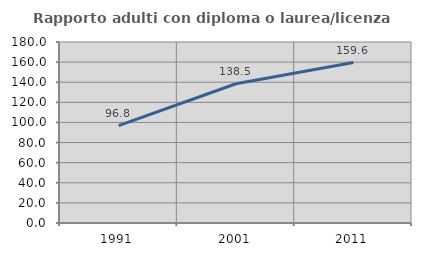
| Category | Rapporto adulti con diploma o laurea/licenza media  |
|---|---|
| 1991.0 | 96.833 |
| 2001.0 | 138.462 |
| 2011.0 | 159.588 |